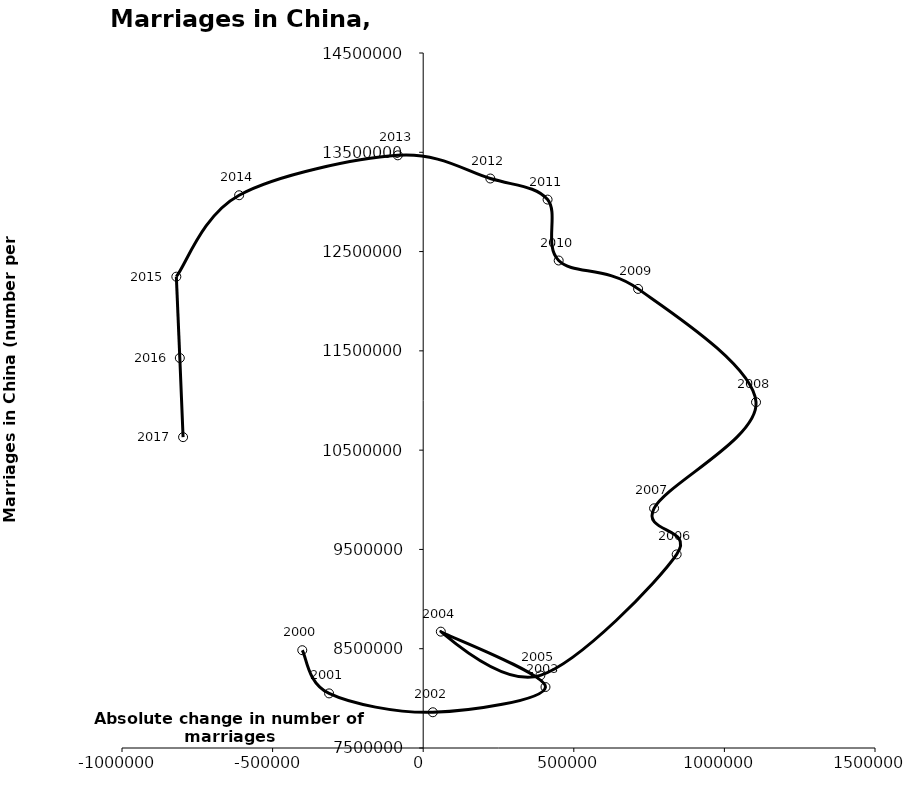
| Category | Series 0 |
|---|---|
| -401500.0 | 8485000 |
| -312500.0 | 8050000 |
| 32000.0 | 7860000 |
| 406000.0 | 8114000 |
| 58500.0 | 8672000 |
| 389000.0 | 8231000 |
| 841500.0 | 9450000 |
| 766500.0 | 9914000 |
| 1105000.0 | 10983000 |
| 713500.0 | 12124000 |
| 449800.0 | 12410000 |
| 412950.0 | 13023600 |
| 222850.0 | 13235900 |
| -84250.0 | 13469300 |
| -611100.0 | 13067400 |
| -819600.0 | 12247100 |
| -808050.0 | 11428200 |
| -797200.0 | 10631000 |